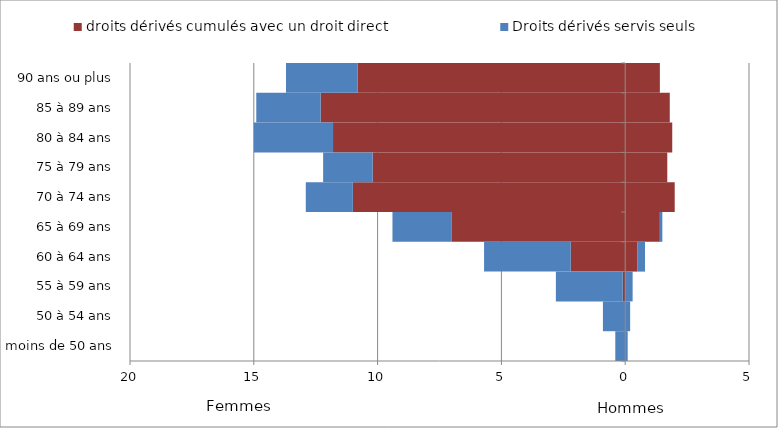
| Category | droits dérivés cumulés avec un droit direct | Series 3 | Series 2 | Droits dérivés servis seuls |
|---|---|---|---|---|
|  moins de 50 ans | 0 | 0 | 0.1 | -0.4 |
|  50 à 54 ans | 0 | 0 | 0.2 | -0.9 |
|  55 à 59 ans | -0.1 | 0 | 0.3 | -2.7 |
|  60 à 64 ans | -2.2 | 0.5 | 0.3 | -3.5 |
|  65 à 69 ans | -7 | 1.4 | 0.1 | -2.4 |
|  70 à 74 ans | -11 | 2 | 0 | -1.9 |
|  75 à 79 ans | -10.2 | 1.7 | 0 | -2 |
|  80 à 84 ans | -11.8 | 1.9 | 0 | -3.2 |
|  85 à 89 ans | -12.3 | 1.8 | 0 | -2.6 |
|  90 ans ou plus | -10.8 | 1.4 | 0 | -2.9 |